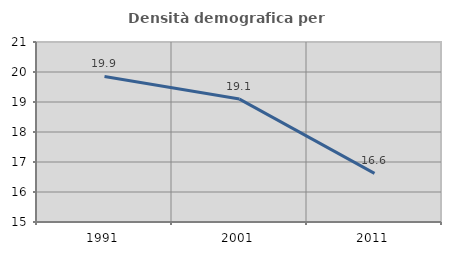
| Category | Densità demografica |
|---|---|
| 1991.0 | 19.852 |
| 2001.0 | 19.097 |
| 2011.0 | 16.622 |